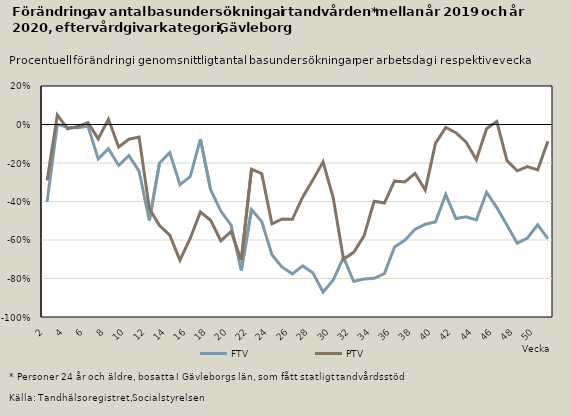
| Category | FTV | PTV |
|---|---|---|
| 2.0 | -0.402 | -0.291 |
| 3.0 | 0.001 | 0.05 |
| 4.0 | -0.014 | -0.023 |
| 5.0 | -0.017 | -0.011 |
| 6.0 | -0.009 | 0.01 |
| 7.0 | -0.179 | -0.075 |
| 8.0 | -0.126 | 0.028 |
| 9.0 | -0.213 | -0.117 |
| 10.0 | -0.162 | -0.076 |
| 11.0 | -0.242 | -0.065 |
| 12.0 | -0.499 | -0.436 |
| 13.0 | -0.199 | -0.525 |
| 14.0 | -0.146 | -0.575 |
| 15.0 | -0.313 | -0.705 |
| 16.0 | -0.271 | -0.592 |
| 17.0 | -0.076 | -0.455 |
| 18.0 | -0.339 | -0.498 |
| 19.0 | -0.45 | -0.604 |
| 20.0 | -0.522 | -0.556 |
| 21.0 | -0.759 | -0.704 |
| 22.0 | -0.442 | -0.232 |
| 23.0 | -0.504 | -0.255 |
| 24.0 | -0.676 | -0.516 |
| 25.0 | -0.741 | -0.491 |
| 26.0 | -0.776 | -0.493 |
| 27.0 | -0.734 | -0.377 |
| 28.0 | -0.77 | -0.289 |
| 29.0 | -0.87 | -0.194 |
| 30.0 | -0.807 | -0.382 |
| 31.0 | -0.69 | -0.7 |
| 32.0 | -0.816 | -0.664 |
| 33.0 | -0.802 | -0.58 |
| 34.0 | -0.799 | -0.399 |
| 35.0 | -0.775 | -0.408 |
| 36.0 | -0.636 | -0.293 |
| 37.0 | -0.601 | -0.299 |
| 38.0 | -0.545 | -0.254 |
| 39.0 | -0.518 | -0.34 |
| 40.0 | -0.506 | -0.098 |
| 41.0 | -0.364 | -0.016 |
| 42.0 | -0.489 | -0.043 |
| 43.0 | -0.48 | -0.092 |
| 44.0 | -0.496 | -0.183 |
| 45.0 | -0.352 | -0.022 |
| 46.0 | -0.432 | 0.016 |
| 47.0 | -0.524 | -0.188 |
| 48.0 | -0.616 | -0.241 |
| 49.0 | -0.59 | -0.219 |
| 50.0 | -0.521 | -0.236 |
| 51.0 | -0.593 | -0.086 |